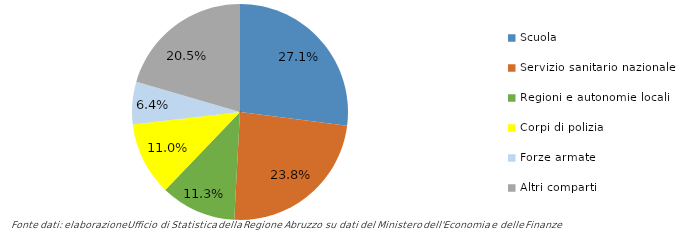
| Category | Series 0 |
|---|---|
| Scuola | 44847440790 |
| Servizio sanitario nazionale | 39503638814 |
| Regioni e autonomie locali | 18768386914 |
| Corpi di polizia | 18207699605 |
| Forze armate | 10605907084 |
| Altri comparti | 33945904492 |